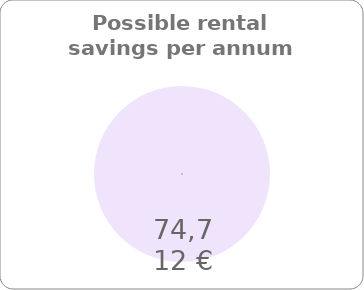
| Category | Series 0 |
|---|---|
| 0 | 74712 |